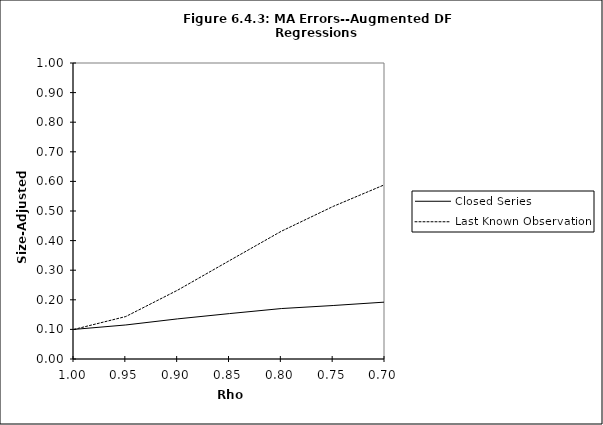
| Category | Closed Series | Last Known Observation |
|---|---|---|
| 1.0 | 0.1 | 0.1 |
| 0.95 | 0.115 | 0.144 |
| 0.9 | 0.136 | 0.233 |
| 0.85 | 0.153 | 0.332 |
| 0.8 | 0.17 | 0.432 |
| 0.75 | 0.181 | 0.516 |
| 0.7 | 0.192 | 0.589 |